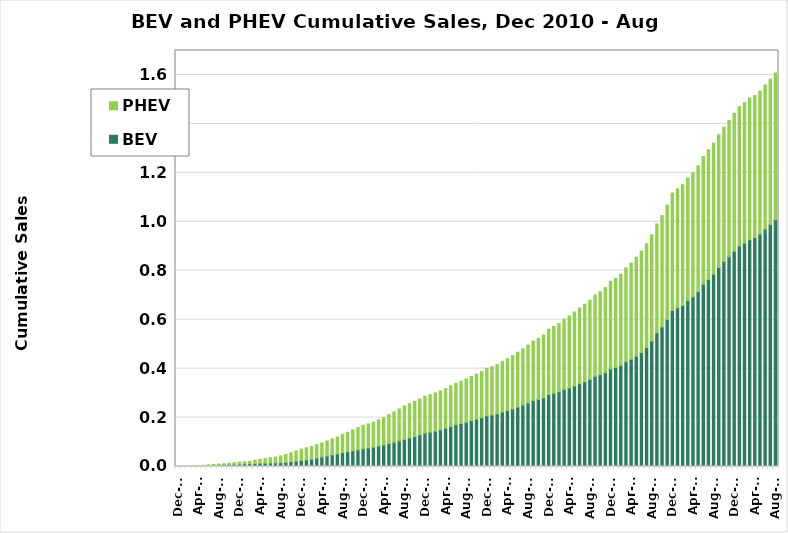
| Category | BEV | PHEV |
|---|---|---|
| Dec-10 | 19 | 326 |
| Jan-11 | 122 | 647 |
| Feb-11 | 205 | 928 |
| Mar-11 | 503 | 1536 |
| Apr-11 | 1076 | 2029 |
| May-11 | 2226 | 2510 |
| Jun-11 | 3934 | 3071 |
| Jul-11 | 4866 | 3196 |
| Aug-11 | 6229 | 3498 |
| Sep-11 | 7260 | 4221 |
| Oct-11 | 8126 | 5329 |
| Nov-11 | 8899 | 6468 |
| Dec-11 | 10111 | 7997 |
| Jan-12 | 10935 | 8600 |
| Feb-12 | 11574 | 9623 |
| Mar-12 | 12535 | 12823 |
| Apr-12 | 13014 | 15939 |
| May-12 | 13626 | 18705 |
| Jun-12 | 14489 | 21160 |
| Jul-12 | 14968 | 23697 |
| Aug-12 | 15834 | 27575 |
| Sep-12 | 17140 | 32078 |
| Oct-12 | 19378 | 37072 |
| Nov-12 | 21992 | 41616 |
| Dec-12 | 24696 | 46581 |
| Jan-13 | 27068 | 48935 |
| Feb-13 | 29734 | 51724 |
| Mar-13 | 34287 | 54803 |
| Apr-13 | 38690 | 57538 |
| May-13 | 43235 | 60747 |
| Jun-13 | 47808 | 64916 |
| Jul-13 | 51751 | 68415 |
| Aug-13 | 56707 | 74822 |
| Sep-13 | 60357 | 79299 |
| Oct-13 | 64090 | 85666 |
| Nov-13 | 68020 | 90569 |
| Dec-13 | 72790 | 95589 |
| Jan-14 | 75761 | 98523 |
| Feb-14 | 79085 | 102244 |
| Mar-14 | 83663 | 106838 |
| Apr-14 | 87850 | 111556 |
| May-14 | 93652 | 118207 |
| Jun-14 | 98634 | 124718 |
| Jul-14 | 104327 | 130458 |
| Aug-14 | 110810 | 136378 |
| Sep-14 | 116793 | 139735 |
| Oct-14 | 122720 | 143470 |
| Nov-14 | 128896 | 147079 |
| Dec-14 | 136315 | 150946 |
| Jan-15 | 140292 | 153059 |
| Feb-15 | 144727 | 155648 |
| Mar-15 | 150442 | 158668 |
| Apr-15 | 156479 | 161630 |
| May-15 | 163536 | 166046 |
| Jun-15 | 170511 | 169455 |
| Jul-15 | 175654 | 173291 |
| Aug-15 | 180878 | 177077 |
| Sep-15 | 187582 | 180115 |
| Oct-15 | 193322 | 184196 |
| Nov-15 | 199425 | 188456 |
| Dec-15 | 207379 | 193890 |
| Jan-16 | 210955 | 197027 |
| Feb-16 | 215379 | 200936 |
| Mar-16 | 222494 | 206255 |
| Apr-16 | 228760 | 212097 |
| May-16 | 235286 | 217716 |
| Jun-16 | 242964 | 223829 |
| Jul-16 | 250726 | 230354 |
| Aug-16 | 259327 | 236726 |
| Sep-16 | 269359 | 242763 |
| Oct-16 | 274767 | 248706 |
| Nov-16 | 281033 | 256564 |
| Dec-16 | 294110 | 266775 |
| Jan-17 | 299508 | 272432 |
| Feb-17 | 305354 | 278679 |
| Mar-17 | 315525 | 286063 |
| Apr-17 | 321486 | 293363 |
| May-17 | 329524 | 302008 |
| Jun-17 | 338338 | 309795 |
| Jul-17 | 346140 | 317202 |
| Aug-17 | 354990 | 324870 |
| Sep-17 | 368411 | 332589 |
| Oct-17 | 375203 | 339254 |
| Nov-17 | 383643 | 347657 |
| Dec-17 | 398602 | 357847 |
| Jan-18 | 404586 | 363873 |
| Feb-18 | 412998 | 372306 |
| Mar-18 | 428271 | 383476 |
| Apr-18 | 437956 | 393414 |
| May-18 | 450778 | 404900 |
| Jun-18 | 465638 | 415075 |
| Jul-18 | 485855 | 424456 |
| Aug-18 | 512340 | 434318 |
| Sep-18 | 546236 | 444966 |
| Oct-18 | 570645 | 454631 |
| Nov-18 | 600464 | 467400 |
| Dec-18 | 637425 | 480339 |
| Jan-19 | 647964 | 486515 |
| Feb-19 | 658036 | 493334 |
| Mar-19 | 677665 | 501344 |
| Apr-19 | 692992 | 507272 |
| May-19 | 714261 | 514389 |
| Jun-19 | 744957 | 521511 |
| Jul-19 | 764615 | 529323 |
| Aug-19 | 785854 | 536554 |
| Sep-19 | 813061 | 542480 |
| Oct-19 | 838014 | 548924 |
| Nov-19 | 857218 | 556563 |
| Dec-19 | 879455 | 564148 |
| Jan-20 | 901150 | 569284 |
| Feb-20 | 912198 | 575568 |
| Mar-20 | 927069 | 578508 |
| Apr-20 | 935111 | 580690 |
| May-20 | 949130 | 584896 |
| Jun-20 | 969880 | 589121 |
| Jul-20 | 988954 | 594038 |
| Aug-20 | 1008118 | 600143 |